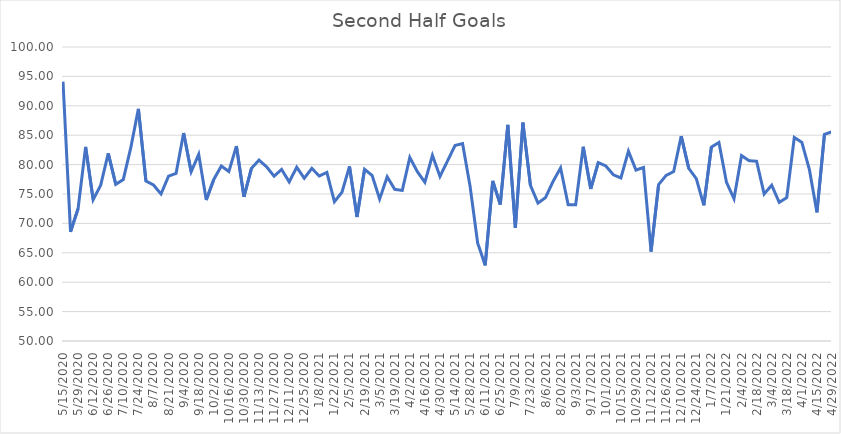
| Category | Series 0 |
|---|---|
| 5/15/20 | 94.118 |
| 5/22/20 | 68.571 |
| 5/29/20 | 72.5 |
| 6/5/20 | 83.019 |
| 6/12/20 | 74.046 |
| 6/19/20 | 76.506 |
| 6/26/20 | 81.915 |
| 7/3/20 | 76.65 |
| 7/10/20 | 77.473 |
| 7/17/20 | 82.927 |
| 7/24/20 | 89.474 |
| 7/31/20 | 77.215 |
| 8/7/20 | 76.543 |
| 8/14/20 | 75 |
| 8/21/20 | 78.03 |
| 8/28/20 | 78.519 |
| 9/4/20 | 85.366 |
| 9/11/20 | 78.774 |
| 9/18/20 | 81.749 |
| 9/25/20 | 73.978 |
| 10/2/20 | 77.47 |
| 10/9/20 | 79.775 |
| 10/16/20 | 78.832 |
| 10/23/20 | 83.154 |
| 10/30/20 | 74.517 |
| 11/6/20 | 79.372 |
| 11/13/20 | 80.769 |
| 11/20/20 | 79.623 |
| 11/27/20 | 78.03 |
| 12/4/20 | 79.184 |
| 12/11/20 | 77.049 |
| 12/18/20 | 79.554 |
| 12/25/20 | 77.679 |
| 1/1/21 | 79.355 |
| 1/8/21 | 78.065 |
| 1/15/21 | 78.673 |
| 1/22/21 | 73.684 |
| 1/29/21 | 75.294 |
| 2/5/21 | 79.703 |
| 2/12/21 | 71.09 |
| 2/19/21 | 79.204 |
| 2/26/21 | 78.157 |
| 3/5/21 | 74.146 |
| 3/12/21 | 77.928 |
| 3/19/21 | 75.789 |
| 3/26/21 | 75.61 |
| 4/2/21 | 81.224 |
| 4/9/21 | 78.802 |
| 4/16/21 | 76.997 |
| 4/23/21 | 81.579 |
| 4/30/21 | 77.99 |
| 5/7/21 | 80.612 |
| 5/14/21 | 83.254 |
| 5/21/21 | 83.571 |
| 5/28/21 | 76.271 |
| 6/4/21 | 66.667 |
| 6/11/21 | 62.857 |
| 6/18/21 | 77.215 |
| 6/25/21 | 73.214 |
| 7/2/21 | 86.765 |
| 7/9/21 | 69.231 |
| 7/16/21 | 87.143 |
| 7/23/21 | 76.471 |
| 7/30/21 | 73.451 |
| 8/6/21 | 74.39 |
| 8/13/21 | 77.132 |
| 8/20/21 | 79.435 |
| 8/27/21 | 73.191 |
| 9/3/21 | 73.171 |
| 9/10/21 | 83.026 |
| 9/17/21 | 75.862 |
| 9/24/21 | 80.351 |
| 10/1/21 | 79.762 |
| 10/8/21 | 78.261 |
| 10/15/21 | 77.739 |
| 10/22/21 | 82.295 |
| 10/29/21 | 79.078 |
| 11/5/21 | 79.498 |
| 11/12/21 | 65.217 |
| 11/19/21 | 76.587 |
| 11/26/21 | 78.161 |
| 12/3/21 | 78.829 |
| 12/10/21 | 84.848 |
| 12/17/21 | 79.348 |
| 12/24/21 | 77.612 |
| 12/31/21 | 73.077 |
| 1/7/22 | 82.979 |
| 1/14/22 | 83.766 |
| 1/21/22 | 77.011 |
| 1/28/22 | 74.194 |
| 2/4/22 | 81.538 |
| 2/11/22 | 80.663 |
| 2/18/22 | 80.569 |
| 2/25/22 | 75 |
| 3/4/22 | 76.496 |
| 3/11/22 | 73.577 |
| 3/18/22 | 74.384 |
| 3/25/22 | 84.615 |
| 4/1/22 | 83.784 |
| 4/8/22 | 79.167 |
| 4/15/22 | 71.875 |
| 4/22/22 | 85.13 |
| 4/29/22 | 85.586 |